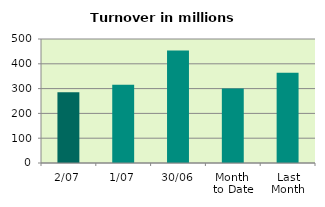
| Category | Series 0 |
|---|---|
| 2/07 | 285.735 |
| 1/07 | 315.619 |
| 30/06 | 453.325 |
| Month 
to Date | 300.677 |
| Last
Month | 364.182 |